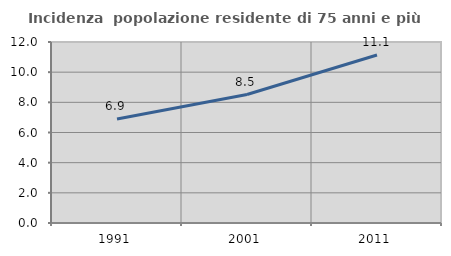
| Category | Incidenza  popolazione residente di 75 anni e più |
|---|---|
| 1991.0 | 6.893 |
| 2001.0 | 8.518 |
| 2011.0 | 11.14 |